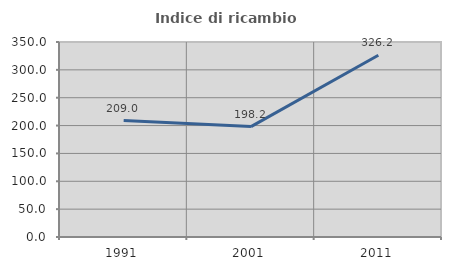
| Category | Indice di ricambio occupazionale  |
|---|---|
| 1991.0 | 209.016 |
| 2001.0 | 198.165 |
| 2011.0 | 326.19 |